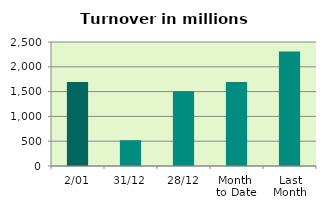
| Category | Series 0 |
|---|---|
| 2/01 | 1693.531 |
| 31/12 | 520.388 |
| 28/12 | 1508.022 |
| Month 
to Date | 1693.531 |
| Last
Month | 2307.928 |